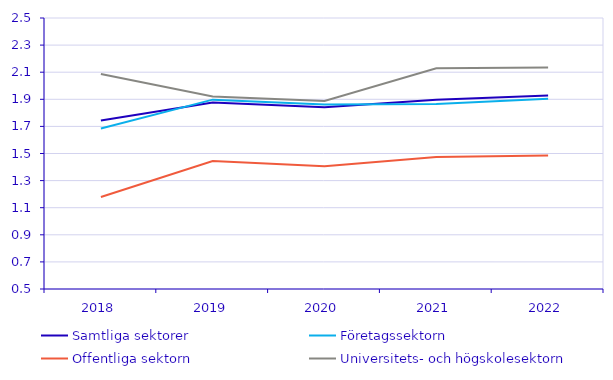
| Category | Samtliga sektorer | Företagssektorn | Offentliga sektorn | Universitets- och högskolesektorn |
|---|---|---|---|---|
| 2018 | 1.743 | 1.684 | 1.179 | 2.087 |
| 2019 | 1.876 | 1.897 | 1.444 | 1.921 |
| 2020 | 1.842 | 1.862 | 1.406 | 1.887 |
| 2021 | 1.897 | 1.865 | 1.473 | 2.129 |
| 2022 | 1.928 | 1.905 | 1.486 | 2.135 |